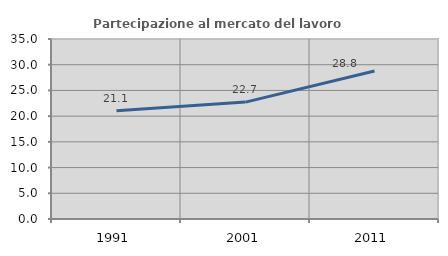
| Category | Partecipazione al mercato del lavoro  femminile |
|---|---|
| 1991.0 | 21.053 |
| 2001.0 | 22.727 |
| 2011.0 | 28.788 |